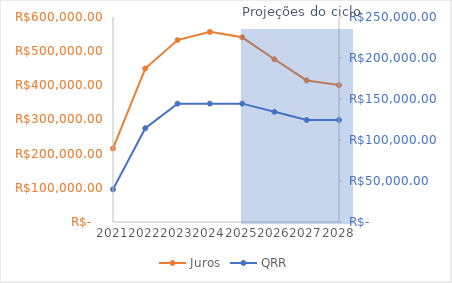
| Category | Juros |
|---|---|
| 2021.0 | 215243.082 |
| 2022.0 | 449187.931 |
| 2023.0 | 532530.143 |
| 2024.0 | 556428.444 |
| 2025.0 | 540552.44 |
| 2026.0 | 476349.758 |
| 2027.0 | 414339.511 |
| 2028.0 | 400618.453 |